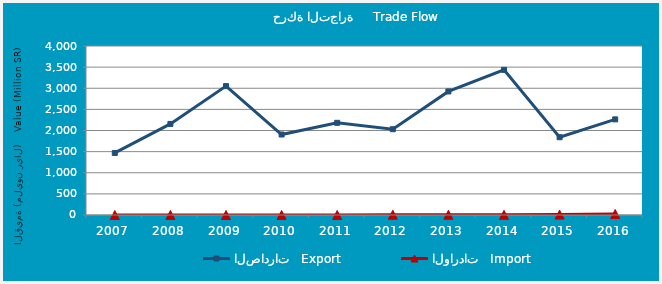
| Category | الصادرات   Export | الواردات   Import |
|---|---|---|
| 2007.0 | 1468.99 | 0.588 |
| 2008.0 | 2155.557 | 0.897 |
| 2009.0 | 3050.356 | 0.014 |
| 2010.0 | 1904.602 | 0.422 |
| 2011.0 | 2181.873 | 0.906 |
| 2012.0 | 2030.71 | 6.76 |
| 2013.0 | 2924.638 | 5.864 |
| 2014.0 | 3435.334 | 5.038 |
| 2015.0 | 1841.122 | 10.073 |
| 2016.0 | 2263.576 | 23.298 |